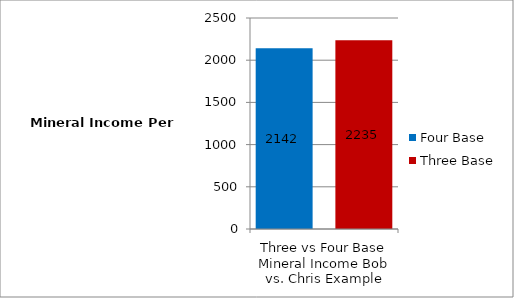
| Category | Four Base | Three Base |
|---|---|---|
| 0 | 2142 | 2235 |